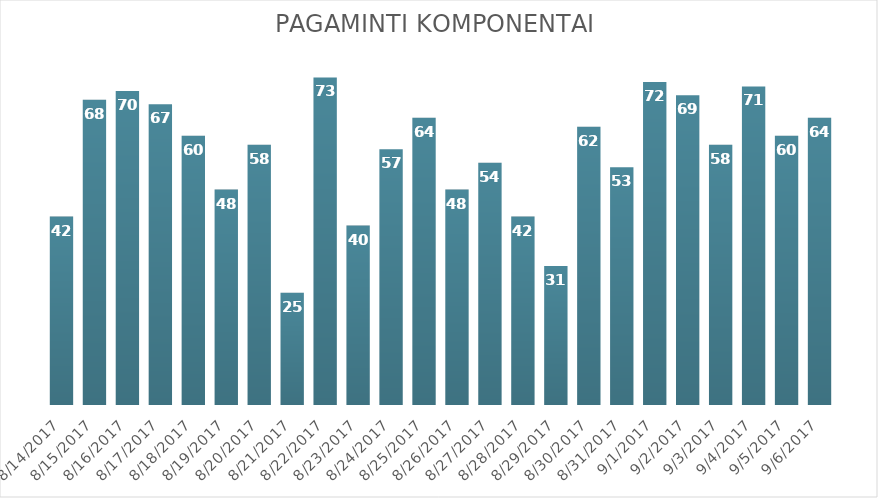
| Category | Pagaminti komponentai |
|---|---|
| 8/14/17 | 42 |
| 8/15/17 | 68 |
| 8/16/17 | 70 |
| 8/17/17 | 67 |
| 8/18/17 | 60 |
| 8/19/17 | 48 |
| 8/20/17 | 58 |
| 8/21/17 | 25 |
| 8/22/17 | 73 |
| 8/23/17 | 40 |
| 8/24/17 | 57 |
| 8/25/17 | 64 |
| 8/26/17 | 48 |
| 8/27/17 | 54 |
| 8/28/17 | 42 |
| 8/29/17 | 31 |
| 8/30/17 | 62 |
| 8/31/17 | 53 |
| 9/1/17 | 72 |
| 9/2/17 | 69 |
| 9/3/17 | 58 |
| 9/4/17 | 71 |
| 9/5/17 | 60 |
| 9/6/17 | 64 |